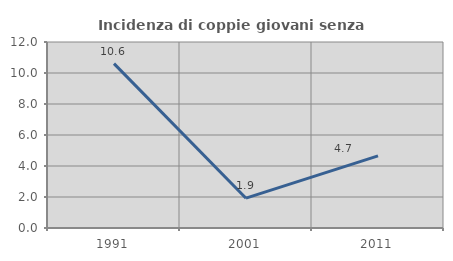
| Category | Incidenza di coppie giovani senza figli |
|---|---|
| 1991.0 | 10.606 |
| 2001.0 | 1.923 |
| 2011.0 | 4.651 |